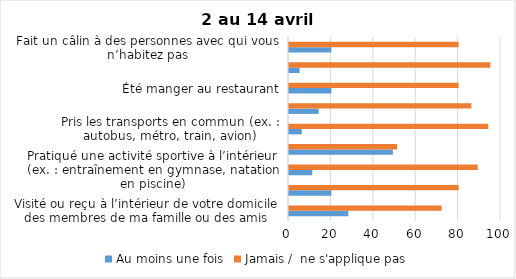
| Category | Au moins une fois | Jamais /  ne s'applique pas |
|---|---|---|
| Visité ou reçu à l’intérieur de votre domicile des membres de ma famille ou des amis | 28 | 72 |
| Visité ou pris soin de vos proches âgés de 70 ans ou plus | 20 | 80 |
| Pratiqué une activité sportive à l’intérieur (ex. : entraînement en gymnase, natation en piscine) | 11 | 89 |
| Pratiqué une activité sportive à l’extérieur (ex. : course à pied, ski) | 49 | 51 |
| Pris les transports en commun (ex. : autobus, métro, train, avion) | 6 | 94 |
| Été dans une autre région du Québec (ex. : j’ai été à mon chalet) | 14 | 86 |
| Été manger au restaurant | 20 | 80 |
| Été au cinéma | 5 | 95 |
| Fait un câlin à des personnes avec qui vous n’habitez pas | 20 | 80 |